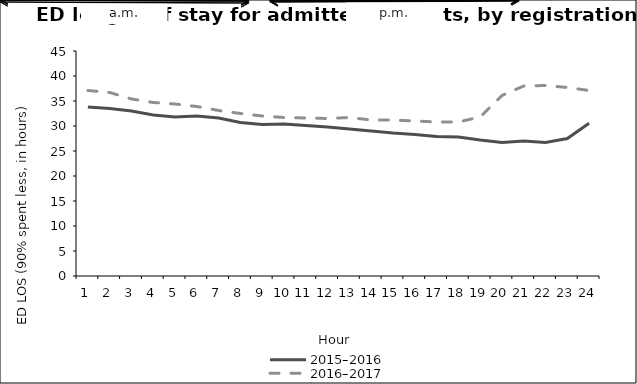
| Category | 2015–2016 | 2016–2017 |
|---|---|---|
| 1.0 | 33.8 | 37.1 |
| 2.0 | 33.5 | 36.7 |
| 3.0 | 33 | 35.4 |
| 4.0 | 32.2 | 34.7 |
| 5.0 | 31.8 | 34.4 |
| 6.0 | 32 | 33.9 |
| 7.0 | 31.6 | 33.1 |
| 8.0 | 30.7 | 32.5 |
| 9.0 | 30.3 | 32 |
| 10.0 | 30.4 | 31.7 |
| 11.0 | 30.1 | 31.6 |
| 12.0 | 29.8 | 31.5 |
| 13.0 | 29.4 | 31.7 |
| 14.0 | 29 | 31.2 |
| 15.0 | 28.6 | 31.2 |
| 16.0 | 28.3 | 31 |
| 17.0 | 27.9 | 30.8 |
| 18.0 | 27.8 | 30.8 |
| 19.0 | 27.2 | 31.8 |
| 20.0 | 26.7 | 36.1 |
| 21.0 | 27 | 38 |
| 22.0 | 26.7 | 38.1 |
| 23.0 | 27.5 | 37.7 |
| 24.0 | 30.53 | 37.1 |